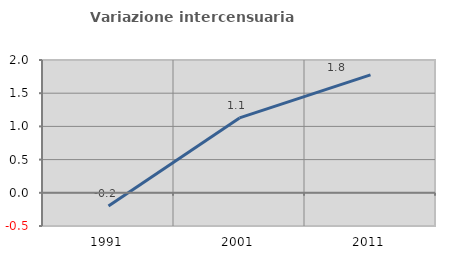
| Category | Variazione intercensuaria annua |
|---|---|
| 1991.0 | -0.199 |
| 2001.0 | 1.128 |
| 2011.0 | 1.776 |